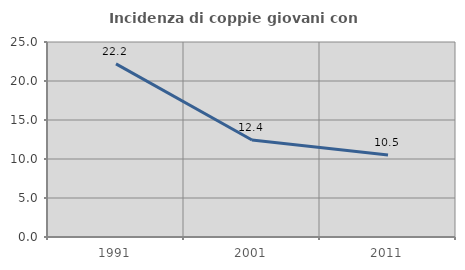
| Category | Incidenza di coppie giovani con figli |
|---|---|
| 1991.0 | 22.188 |
| 2001.0 | 12.442 |
| 2011.0 | 10.503 |